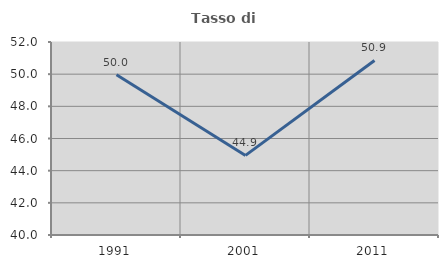
| Category | Tasso di occupazione   |
|---|---|
| 1991.0 | 49.962 |
| 2001.0 | 44.949 |
| 2011.0 | 50.85 |